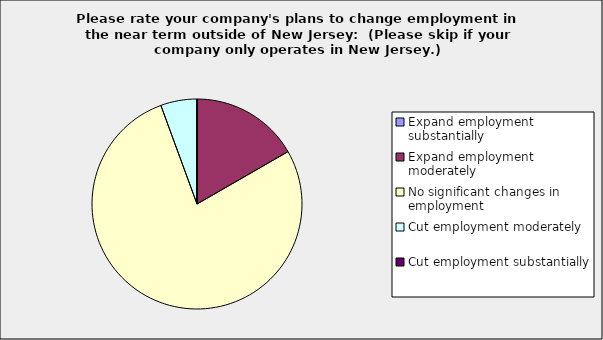
| Category | Series 0 |
|---|---|
| Expand employment substantially | 0 |
| Expand employment moderately | 0.167 |
| No significant changes in employment | 0.778 |
| Cut employment moderately | 0.056 |
| Cut employment substantially | 0 |